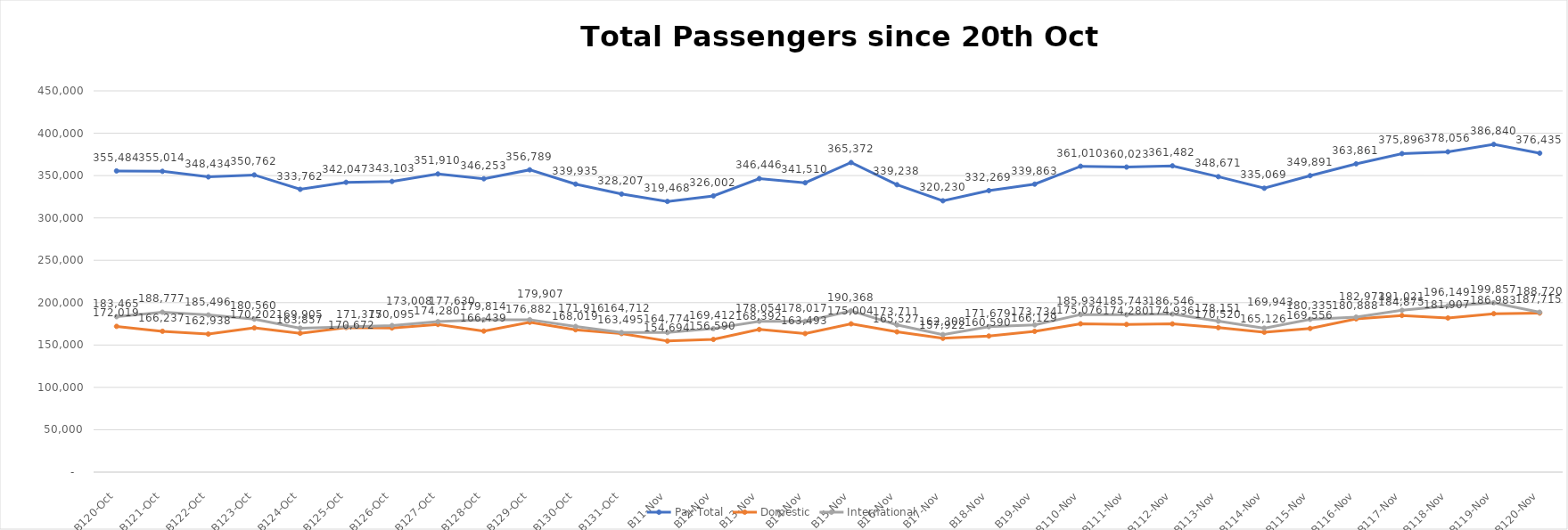
| Category | Pax Total | Domestic | International |
|---|---|---|---|
| 2023-10-20 | 355484 | 172019 | 183465 |
| 2023-10-21 | 355014 | 166237 | 188777 |
| 2023-10-22 | 348434 | 162938 | 185496 |
| 2023-10-23 | 350762 | 170202 | 180560 |
| 2023-10-24 | 333762 | 163857 | 169905 |
| 2023-10-25 | 342047 | 170672 | 171375 |
| 2023-10-26 | 343103 | 170095 | 173008 |
| 2023-10-27 | 351910 | 174280 | 177630 |
| 2023-10-28 | 346253 | 166439 | 179814 |
| 2023-10-29 | 356789 | 176882 | 179907 |
| 2023-10-30 | 339935 | 168019 | 171916 |
| 2023-10-31 | 328207 | 163495 | 164712 |
| 2023-11-01 | 319468 | 154694 | 164774 |
| 2023-11-02 | 326002 | 156590 | 169412 |
| 2023-11-03 | 346446 | 168392 | 178054 |
| 2023-11-04 | 341510 | 163493 | 178017 |
| 2023-11-05 | 365372 | 175004 | 190368 |
| 2023-11-06 | 339238 | 165527 | 173711 |
| 2023-11-07 | 320230 | 157922 | 162308 |
| 2023-11-08 | 332269 | 160590 | 171679 |
| 2023-11-09 | 339863 | 166129 | 173734 |
| 2023-11-10 | 361010 | 175076 | 185934 |
| 2023-11-11 | 360023 | 174280 | 185743 |
| 2023-11-12 | 361482 | 174936 | 186546 |
| 2023-11-13 | 348671 | 170520 | 178151 |
| 2023-11-14 | 335069 | 165126 | 169943 |
| 2023-11-15 | 349891 | 169556 | 180335 |
| 2023-11-16 | 363861 | 180888 | 182973 |
| 2023-11-17 | 375896 | 184875 | 191021 |
| 2023-11-18 | 378056 | 181907 | 196149 |
| 2023-11-19 | 386840 | 186983 | 199857 |
| 2023-11-20 | 376435 | 187715 | 188720 |